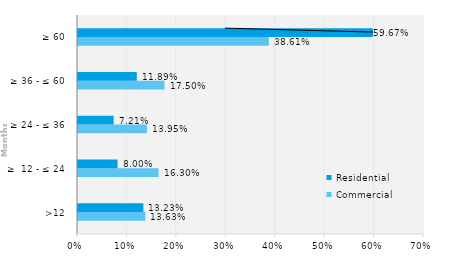
| Category | Commercial | Residential |
|---|---|---|
| >12 | 0.136 | 0.132 |
| ≥  12 - ≤ 24 | 0.163 | 0.08 |
| ≥ 24 - ≤ 36 | 0.14 | 0.072 |
| ≥ 36 - ≤ 60 | 0.175 | 0.119 |
| ≥ 60 | 0.386 | 0.597 |